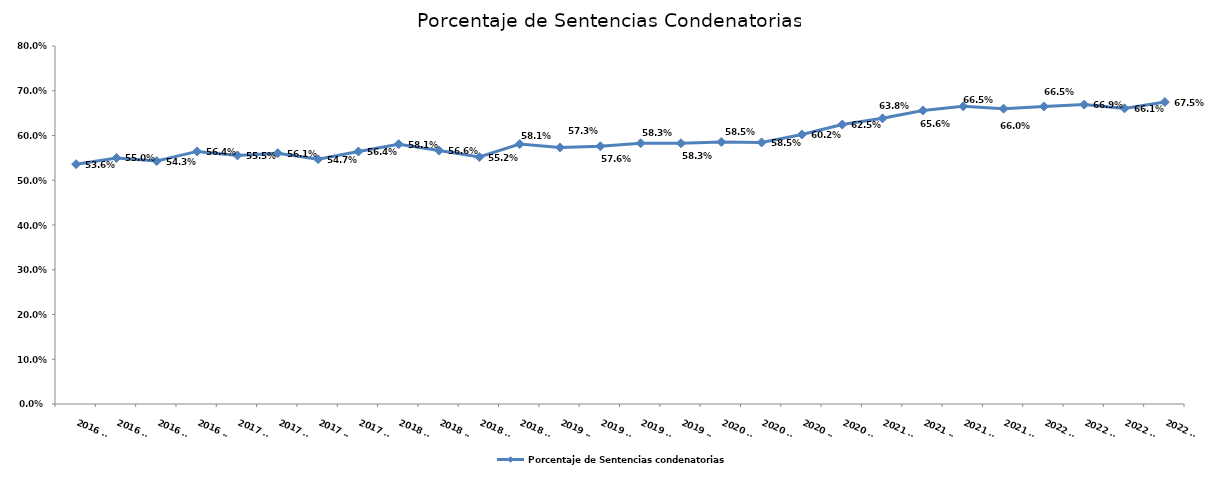
| Category | Porcentaje de Sentencias condenatorias |
|---|---|
| 2016 T1 | 0.536 |
| 2016 T2 | 0.55 |
| 2016 T3 | 0.543 |
| 2016 T4 | 0.564 |
| 2017 T1 | 0.555 |
| 2017 T2 | 0.561 |
| 2017 T3 | 0.547 |
| 2017 T4 | 0.564 |
| 2018 T1 | 0.581 |
| 2018 T2 | 0.566 |
| 2018 T3 | 0.552 |
| 2018 T4 | 0.581 |
| 2019 T1 | 0.573 |
| 2019 T2 | 0.576 |
| 2019 T3 | 0.583 |
| 2019 T4 | 0.583 |
| 2020 T1 | 0.585 |
| 2020 T2 | 0.585 |
| 2020 T3 | 0.602 |
| 2020 T4 | 0.625 |
| 2021 T1 | 0.638 |
| 2021 T2 | 0.656 |
| 2021 T3 | 0.665 |
| 2021 T4 | 0.66 |
| 2022 T1 | 0.665 |
| 2022 T2 | 0.669 |
| 2022 T3 | 0.661 |
| 2022 T4 | 0.675 |